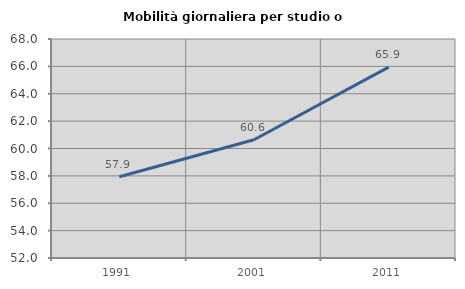
| Category | Mobilità giornaliera per studio o lavoro |
|---|---|
| 1991.0 | 57.938 |
| 2001.0 | 60.638 |
| 2011.0 | 65.941 |